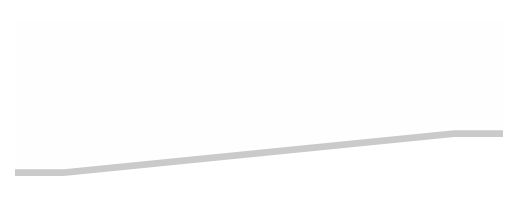
| Category | S1 | S2 | S3 |
|---|---|---|---|
| 0.0 | 1780 | 80 | 70 |
| 10.0 | 1780 | 80 | 70 |
| 90.0 | 1320 | 80 | 530 |
| 100.0 | 1320 | 80 | 530 |